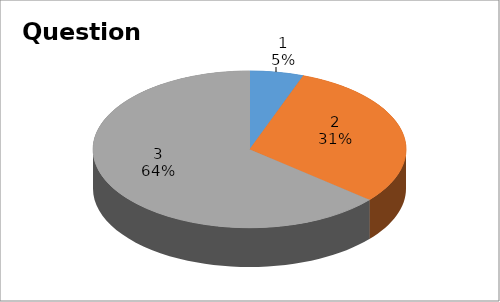
| Category | Series 0 |
|---|---|
| 0 | 2 |
| 1 | 11 |
| 2 | 23 |